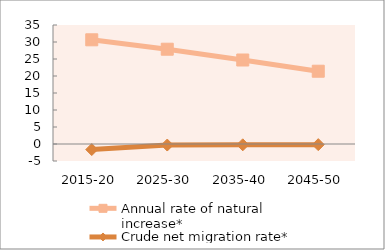
| Category | Annual rate of natural increase* | Crude net migration rate* |
|---|---|---|
| 2015-20 | 30.646 | -1.636 |
| 2025-30 | 27.878 | -0.307 |
| 2035-40 | 24.704 | -0.237 |
| 2045-50 | 21.403 | -0.189 |